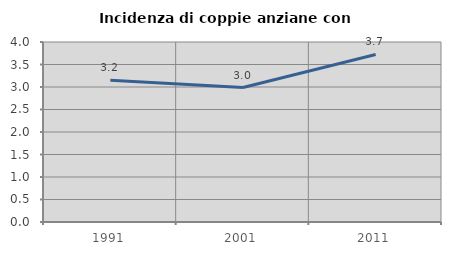
| Category | Incidenza di coppie anziane con figli |
|---|---|
| 1991.0 | 3.152 |
| 2001.0 | 2.987 |
| 2011.0 | 3.723 |